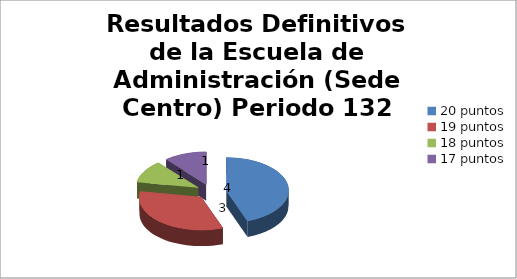
| Category | Series 0 |
|---|---|
| 20 puntos | 4 |
| 19 puntos | 3 |
| 18 puntos | 1 |
| 17 puntos | 1 |